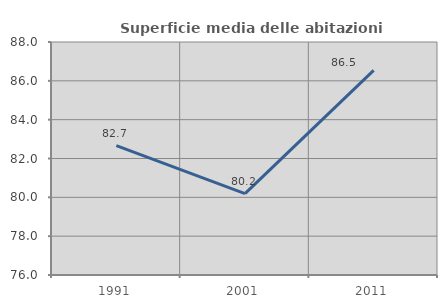
| Category | Superficie media delle abitazioni occupate |
|---|---|
| 1991.0 | 82.66 |
| 2001.0 | 80.188 |
| 2011.0 | 86.541 |